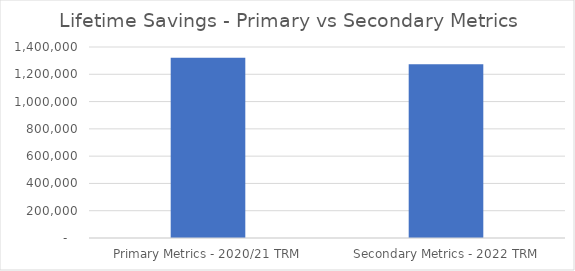
| Category | Series 0 |
|---|---|
|  Primary Metrics - 2020/21 TRM  | 1321220.277 |
|  Secondary Metrics - 2022 TRM  | 1273462.604 |